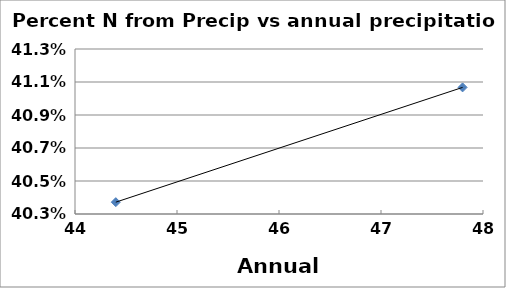
| Category | total load |
|---|---|
| 47.8 | 0.411 |
| 44.4 | 0.404 |